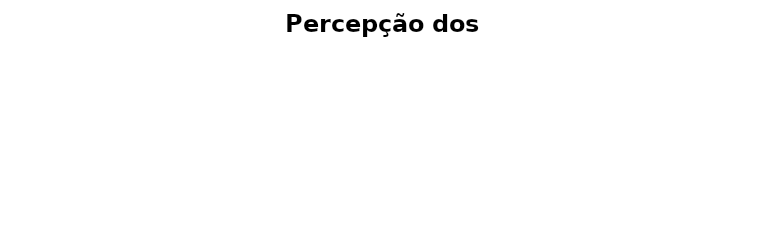
| Category | Series 2 |
|---|---|
| Cárdio | 0 |
| Nucal | 0 |
| Corono | 0 |
| Esplênico | 0 |
| Fronto | 0 |
| Laringo | 0 |
| Palmo | 0 |
| Planto | 0 |
| Sexo | 0 |
| Umbílico | 0 |